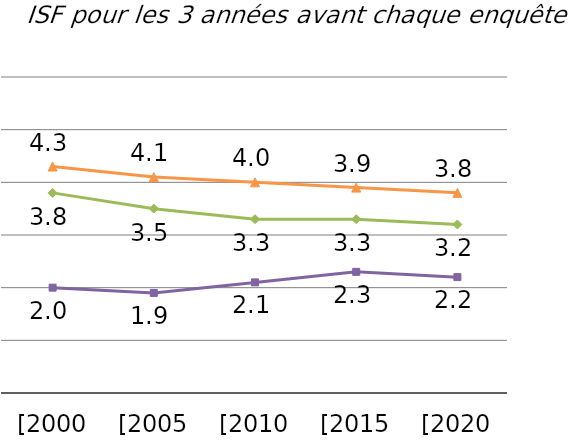
| Category | Ensemble | Urbain | Rural |
|---|---|---|---|
| [2000 xDHS] | 3.8 | 2 | 4.3 |
| [2005 xDHS] | 3.5 | 1.9 | 4.1 |
| [2010 xDHS] | 3.3 | 2.1 | 4 |
| [2015 xDHS] | 3.3 | 2.3 | 3.9 |
| [2020 xDHS] | 3.2 | 2.2 | 3.8 |